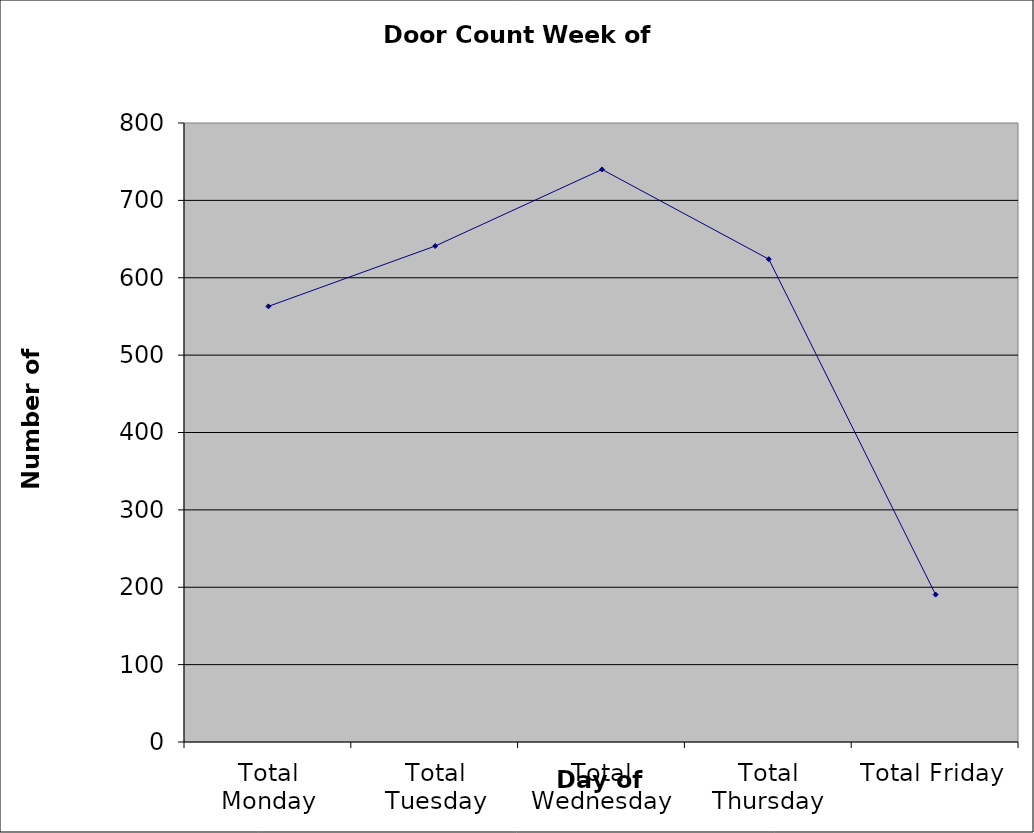
| Category | Series 0 |
|---|---|
| Total Monday | 563 |
| Total Tuesday | 641 |
| Total Wednesday | 740 |
| Total Thursday | 624 |
| Total Friday | 190.5 |